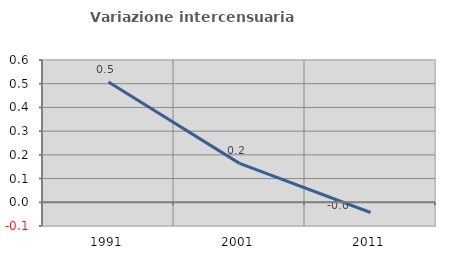
| Category | Variazione intercensuaria annua |
|---|---|
| 1991.0 | 0.508 |
| 2001.0 | 0.164 |
| 2011.0 | -0.043 |